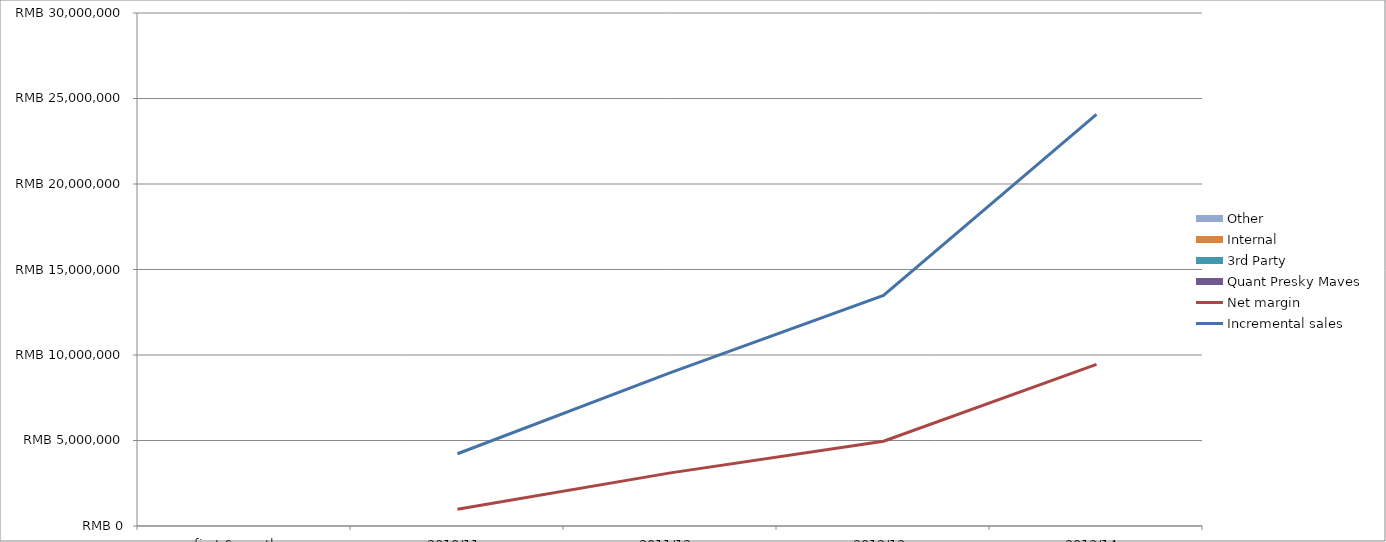
| Category | Quant Presky Maves  | 3rd Party | Internal | Other |
|---|---|---|---|---|
| first 6 months | 0 | 0 | 0 | 0 |
| 2010/11 | 0 | 0 | 0 | 0 |
| 2011/12 | 0 | 0 | 0 | 0 |
| 2012/13 | 0 | 0 | 0 | 0 |
| 2013/14 | 0 | 0 | 0 | 0 |